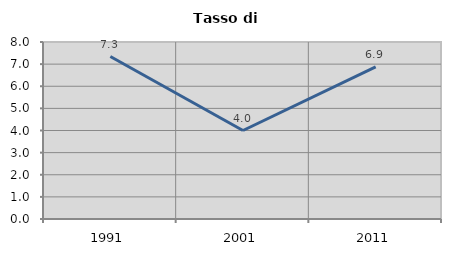
| Category | Tasso di disoccupazione   |
|---|---|
| 1991.0 | 7.343 |
| 2001.0 | 4 |
| 2011.0 | 6.873 |